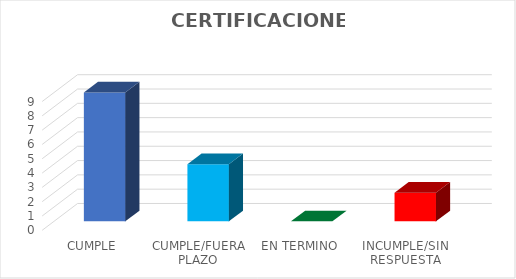
| Category | TOTAL |
|---|---|
| CUMPLE | 9 |
| CUMPLE/FUERA PLAZO | 4 |
| EN TERMINO | 0 |
| INCUMPLE/SIN RESPUESTA | 2 |